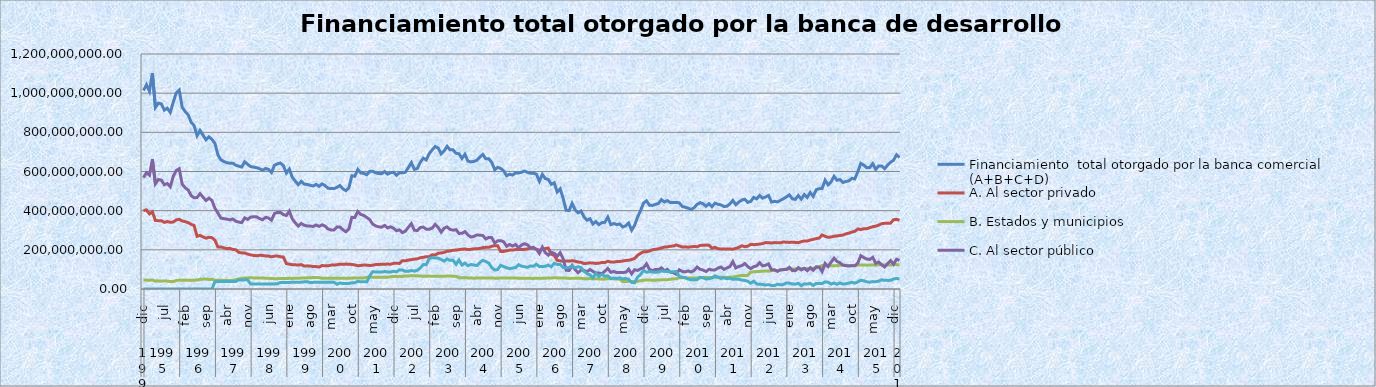
| Category | Financiamiento  total otorgado por la banca comercial (A+B+C+D)  | A. Al sector privado  | B. Estados y municipios  | C. Al sector público  | D. Otros  |
|---|---|---|---|---|---|
| 0 | 1013759422.311 | 400063716.096 | 45305367.947 | 568390338.269 | 0 |
| 1 | 1043258163.285 | 403913415.998 | 45420746.077 | 593924001.211 | 0 |
| 2 | 1009134550.045 | 383374612.839 | 44694134.748 | 581065802.458 | 0 |
| 3 | 1102391728.948 | 393973178.428 | 46096469.255 | 662322081.264 | 0 |
| 4 | 926967845.892 | 349683881.886 | 40066765.647 | 537217198.359 | 0 |
| 5 | 949112419.855 | 348849746.567 | 40961895.329 | 559300777.959 | 0 |
| 6 | 945465827.873 | 349121375.24 | 40300629.555 | 556043823.078 | 0 |
| 7 | 913150563.498 | 340225925.27 | 40392504.281 | 532532133.946 | 0 |
| 8 | 923301489.197 | 344502504.427 | 40314352.648 | 538484632.122 | 0 |
| 9 | 901114473.518 | 340871398.832 | 38402080.778 | 521840993.908 | 0 |
| 10 | 954073362.155 | 341833775.714 | 37476021.571 | 574763564.87 | 0 |
| 11 | 1001304203.055 | 352761577.691 | 43529335.426 | 605013289.937 | 0 |
| 12 | 1016268312.671 | 356184126.198 | 45624290.098 | 614459896.375 | 0 |
| 13 | 928514569.577 | 347484875.566 | 45116147.236 | 535913546.775 | 0 |
| 14 | 906002887.062 | 344002355.635 | 45017991.304 | 516982540.123 | 0 |
| 15 | 889604159.521 | 338857363.009 | 44986368.766 | 505760427.746 | 0 |
| 16 | 851789507.846 | 330726173.25 | 43908480.305 | 477154854.291 | 0 |
| 17 | 834599606.824 | 323961666.939 | 44868300.166 | 465769639.719 | 0 |
| 18 | 782596629.535 | 269241074.654 | 46261768.297 | 467093786.584 | 0 |
| 19 | 809769263.149 | 273675482.968 | 49122635.427 | 486971144.754 | 0 |
| 20 | 785521002.259 | 266025258.291 | 50408739.999 | 469087003.969 | 0 |
| 21 | 761919282.189 | 259550259.016 | 50685693.778 | 451683329.395 | 0 |
| 22 | 776871643.44 | 264157259.627 | 48699710.756 | 464014673.057 | 0 |
| 23 | 763984702.837 | 262272126.678 | 49645598.942 | 452066977.217 | 0 |
| 24 | 744108008.95 | 248950043.082 | 45310017.842 | 412315238.187 | 37532709.839 |
| 25 | 685041782.07 | 214222417.398 | 45209578.53 | 387901005.269 | 37708780.873 |
| 26 | 659671685.688 | 215047609.503 | 44857109.026 | 361881491.798 | 37885475.361 |
| 27 | 651096060.135 | 210072672.293 | 43583324.561 | 359435278.198 | 38004785.083 |
| 28 | 645141965.447 | 205955062.883 | 44450352.966 | 356705953.333 | 38030596.265 |
| 29 | 642291126.064 | 207894679.326 | 43192826.913 | 353131357.694 | 38072262.132 |
| 30 | 642630839.335 | 201775402.02 | 45132657.289 | 357657186.82 | 38065593.206 |
| 31 | 632017710.128 | 200698547.233 | 47110189.856 | 346132276.283 | 38076696.756 |
| 32 | 627312136.936 | 187028689.356 | 51790747.632 | 341893348.301 | 46599351.648 |
| 33 | 623073557.847 | 184463123.985 | 53403138.484 | 338766730.851 | 46440564.527 |
| 34 | 649379588.859 | 183593594.324 | 56227551.367 | 362922448.213 | 46635994.955 |
| 35 | 636597840.178 | 178341822.72 | 56137769.609 | 355528928.439 | 46589319.41 |
| 36 | 625140378.615 | 174147048.128 | 58087378.396 | 367242476.617 | 25663475.475 |
| 37 | 622363907.296 | 171342118.377 | 56242704.471 | 368616108.938 | 26162975.51 |
| 38 | 619555266.338 | 169809220.917 | 55807489.809 | 368304739.618 | 25633815.994 |
| 39 | 614216659.91 | 172322470.03 | 56548806.514 | 359702812.556 | 25642570.81 |
| 40 | 606476323.801 | 171297933.807 | 56195357.206 | 353376452.229 | 25606580.559 |
| 41 | 615240739.496 | 168889369.571 | 55197639.2 | 365640281.773 | 25513448.951 |
| 42 | 611022221.229 | 168007433.718 | 54705947.277 | 362754345.775 | 25554494.459 |
| 43 | 594989565.55 | 164555650.955 | 53567841.272 | 351220652.418 | 25645420.904 |
| 44 | 631722609.291 | 167710840.995 | 52805880.151 | 385231716.628 | 25974171.517 |
| 45 | 639076564.424 | 168297961.966 | 52808028.803 | 390888932.254 | 27081641.402 |
| 46 | 643008633.953 | 164660735.578 | 53332609.471 | 391216897.091 | 33798391.812 |
| 47 | 629882162.123 | 163028246.811 | 53325664.239 | 379955082.217 | 33573168.856 |
| 48 | 592330262.587 | 129866654.162 | 53295751.014 | 375519265.524 | 33648591.887 |
| 49 | 612473371.561 | 126739749.641 | 54499618.09 | 397538651.393 | 33695352.437 |
| 50 | 570116076.218 | 124176754.561 | 53937217.884 | 357985040.156 | 34017063.618 |
| 51 | 550783756.357 | 123491107.333 | 55113684.608 | 337837134.138 | 34341830.278 |
| 52 | 533060548.812 | 122217192.562 | 55180250.899 | 321048033.767 | 34615071.584 |
| 53 | 549779748.038 | 124405151.892 | 55644550.238 | 334743054.005 | 34986991.902 |
| 54 | 535455330.439 | 117362564.47 | 56010452.957 | 325581483.612 | 36500829.401 |
| 55 | 533847706.511 | 118191368.399 | 57144108.286 | 321780560.829 | 36731668.997 |
| 56 | 529867407.073 | 117180826.857 | 57823472.654 | 321251114.705 | 33611992.858 |
| 57 | 525830069.301 | 114633654.769 | 58252849.385 | 319136813.252 | 33806751.895 |
| 58 | 534313651.916 | 114512195.627 | 58713116.177 | 326852102.316 | 34236237.795 |
| 59 | 524211521.646 | 112062454.564 | 57995511.513 | 319788923.722 | 34364631.847 |
| 60 | 536717338.633 | 120006535.375 | 54333378.012 | 327832247.481 | 34545177.766 |
| 61 | 528467790.439 | 118143850.589 | 54274551.478 | 321403933.16 | 34645455.212 |
| 62 | 514076521.381 | 118308892.598 | 54399747.211 | 306429259.368 | 34938622.203 |
| 63 | 513418723.72 | 121852557.885 | 54804250.663 | 301643949.933 | 35117965.239 |
| 64 | 512743343.564 | 122279160.205 | 54411512.191 | 301401902.246 | 34650768.922 |
| 65 | 519110167.176 | 123880300.471 | 54393768.15 | 316392629.621 | 24443468.934 |
| 66 | 528595832.129 | 126909483.163 | 54606863 | 316241112.29 | 30838373.676 |
| 67 | 511385013.277 | 125701348.771 | 54881697.003 | 302552295.594 | 28249671.909 |
| 68 | 502224349.089 | 127133420.318 | 54500151.069 | 292322590.476 | 28268187.225 |
| 69 | 515935828.505 | 126752787.372 | 54494504.128 | 306078042.802 | 28610494.202 |
| 70 | 578333497.313 | 125125661.704 | 55917782.209 | 366158556.004 | 31131497.396 |
| 71 | 575716533.717 | 123095541.239 | 55654025.269 | 364548971.32 | 32417995.889 |
| 72 | 609941116.094 | 118883037.677 | 55766214.098 | 396034143.255 | 39257721.064 |
| 73 | 592601719.228 | 119878073.321 | 55572321.133 | 380677440.848 | 36473883.924 |
| 74 | 590816863.458 | 122301208.877 | 56387509.217 | 375550085.664 | 36578059.7 |
| 75 | 583464109.195 | 121849097.632 | 59654472.233 | 365591044.363 | 36369494.967 |
| 76 | 600875050.673 | 120003122.421 | 59650558.116 | 354329545.458 | 66891824.678 |
| 77 | 601167916.934 | 121288706.179 | 59757207.777 | 331531165.774 | 88590837.203 |
| 78 | 593836124.584 | 124809492.86 | 59914754.506 | 322352489.136 | 86759388.081 |
| 79 | 589771961.413 | 125083331.541 | 60568906.667 | 317562654.845 | 86557068.359 |
| 80 | 588669250.484 | 126531349.768 | 60372046.899 | 315448250.057 | 86317603.759 |
| 81 | 599693275.251 | 125733199.22 | 60064701.786 | 324711162.509 | 89184211.735 |
| 82 | 586426559.677 | 127583454.929 | 59761703.404 | 311862365.354 | 87219035.99 |
| 83 | 593799511.413 | 126457684.585 | 62845328.553 | 317405362.354 | 87091135.921 |
| 84 | 595922887.017 | 130887150.746 | 64033518.212 | 310472903.555 | 90529314.504 |
| 85 | 580494787.47 | 131400266.992 | 63643911.847 | 297410186.224 | 88040422.407 |
| 86 | 594958333.088 | 130589970.02 | 64585622.516 | 301966983.068 | 97815757.485 |
| 87 | 593403876.567 | 144605113.88 | 64065826.417 | 287828374.324 | 96904561.946 |
| 88 | 596309067.253 | 143698032.401 | 66552098.988 | 295861299.113 | 90197636.751 |
| 89 | 620552454.178 | 147625584.759 | 66804427.761 | 315597012.524 | 90525429.133 |
| 90 | 645597234.162 | 149996929.608 | 67296795.708 | 333977323.228 | 94326185.617 |
| 91 | 611002805.169 | 152359435.801 | 67139182.531 | 300220818.82 | 91283368.016 |
| 92 | 615495377.228 | 154073956.048 | 67371069.001 | 298352080.306 | 95698271.873 |
| 93 | 646582971.278 | 159359122.189 | 66072881.244 | 313942042.957 | 107208924.887 |
| 94 | 668236959.821 | 162021646.908 | 65328282.307 | 316004056.799 | 124882973.806 |
| 95 | 658936163.474 | 164850395.692 | 64983024.638 | 305289792.275 | 123812950.869 |
| 96 | 691644995.178 | 164940243.011 | 65869997.755 | 305058873.882 | 155775880.53 |
| 97 | 710407112.066 | 174647098.492 | 65351413.735 | 310931225.381 | 159477374.458 |
| 98 | 727733806.336 | 173563920.623 | 65561312.683 | 329930998.894 | 158677574.136 |
| 99 | 719859724.421 | 182567553.248 | 65245101.393 | 314540179.143 | 157506890.636 |
| 100 | 689552366.141 | 183745815.539 | 64924888.399 | 290287591.017 | 150594071.187 |
| 101 | 705038188.179 | 187019195.227 | 65128182.506 | 310585688.836 | 142305121.61 |
| 102 | 728757070.675 | 192744089.913 | 66093944.914 | 317089477.724 | 152829558.124 |
| 103 | 710451834.338 | 193800898.312 | 65856287.96 | 304428030.326 | 146366617.74 |
| 104 | 710690010.63 | 198109377.203 | 65607309.621 | 300359171.16 | 146614152.645 |
| 105 | 692800241.824 | 198766909.219 | 64987921.35 | 302868246.592 | 126177164.663 |
| 106 | 690505153.955 | 200958874.314 | 57828126.886 | 283943755.868 | 147774396.887 |
| 107 | 666760465.172 | 203151007.669 | 57168239.867 | 284202027.579 | 122239190.057 |
| 108 | 687973040.704 | 204128123.56 | 58106577.364 | 293371682.048 | 132366657.732 |
| 109 | 652897828.076 | 201344398.348 | 56812761.338 | 275819413.354 | 118921255.037 |
| 110 | 649017550.46 | 202609248.746 | 55980385.777 | 265320551.397 | 125107364.54 |
| 111 | 651587992.971 | 204888655.796 | 55334820.14 | 268634484.808 | 122730032.229 |
| 112 | 657163833.929 | 205051970.151 | 56206862.124 | 276098455.081 | 119806546.573 |
| 113 | 673162108.612 | 207168374.47 | 56312947.993 | 274694311.132 | 134986475.017 |
| 114 | 687186907.454 | 210998937.384 | 56141116.744 | 273210197.193 | 146836656.133 |
| 115 | 664818847.559 | 212795703.72 | 56149342.987 | 255445001.736 | 140428799.116 |
| 116 | 664818334.872 | 212896818.167 | 56015714.706 | 263551169.795 | 132354632.204 |
| 117 | 646701005.082 | 218218751.579 | 56799426.909 | 262399670.419 | 109283156.174 |
| 118 | 608805470.562 | 221500402.949 | 55296337.941 | 234907343.61 | 97101386.062 |
| 119 | 621293008.789 | 221294744.154 | 54869245.782 | 245786118.807 | 99342900.046 |
| 120 | 615720209.192 | 191251727.933 | 56309836.332 | 247094838.861 | 121063806.066 |
| 121 | 603533130.24 | 192006176.59 | 56017706.094 | 241077673.147 | 114431574.409 |
| 122 | 578354340.261 | 194715285.366 | 56659520.606 | 218348155.253 | 108631379.036 |
| 123 | 586208844.852 | 198512001.369 | 56534936.052 | 227452275.616 | 103709631.815 |
| 124 | 581641896.179 | 198884262.048 | 56415493.618 | 219610186.669 | 106731953.845 |
| 125 | 593237858.313 | 201194928.039 | 55671384.101 | 227126336.691 | 109245209.482 |
| 126 | 591895986.978 | 201756659.632 | 55339042.805 | 210827850.592 | 123972433.949 |
| 127 | 596272673.829 | 201085799.373 | 54215355.637 | 224397144.289 | 116574374.53 |
| 128 | 602331827.486 | 202464844.422 | 54692260.779 | 231342022.618 | 113832699.667 |
| 129 | 595830765.679 | 204562155.757 | 54513195.405 | 225807910.523 | 110947503.994 |
| 130 | 591568895.438 | 209060485.411 | 54472764.694 | 210081139.886 | 117954505.447 |
| 131 | 590992778.025 | 212704772.581 | 53906196.31 | 208445404.141 | 115936404.994 |
| 132 | 586571173.56 | 202190438.499 | 55182859.815 | 202968434.66 | 126229440.586 |
| 133 | 549895349.003 | 198464694.119 | 55102913.242 | 181665171.797 | 114662569.846 |
| 134 | 585130493.587 | 202432067.113 | 54754837.858 | 213777649.216 | 114165939.4 |
| 135 | 563673046.869 | 206708910.585 | 55087994.683 | 185642411.518 | 116233730.082 |
| 136 | 559693572.581 | 208976772.703 | 55985656.887 | 172684841.79 | 122046301.202 |
| 137 | 534532829.946 | 177752365.974 | 56185783.915 | 187469562.398 | 113125117.659 |
| 138 | 542455521.236 | 171685792.518 | 57507756.316 | 182125367.074 | 131136605.328 |
| 139 | 495004101.718 | 146032081.39 | 56732589.237 | 167070758.425 | 125168672.666 |
| 140 | 511426980.75 | 143559515.67 | 56629579.388 | 185490179.677 | 125747706.016 |
| 141 | 462409633.652 | 141511333.354 | 56070411.17 | 155048901.074 | 109778988.053 |
| 142 | 402091042.258 | 142589617.851 | 55585205.377 | 95790875.311 | 108125343.719 |
| 143 | 400726561.211 | 142257402.276 | 54028340.897 | 94372130.434 | 110068687.604 |
| 144 | 437354064.871 | 144636234.621 | 54409688.853 | 120416790.434 | 117891350.963 |
| 145 | 404795247.753 | 142227099.274 | 54939877.439 | 99375727.97 | 108252543.07 |
| 146 | 389191606.464 | 137665824.459 | 54957648.02 | 82718565.589 | 113849568.396 |
| 147 | 398157737.564 | 136390090.762 | 55064362.837 | 97447300.627 | 109255983.338 |
| 148 | 367971781.888 | 129568424.091 | 52366365.145 | 95279551.803 | 90757440.849 |
| 149 | 351346977.859 | 131117451.775 | 52770546.192 | 88410684.926 | 79048294.966 |
| 150 | 358587911.941 | 133611869.477 | 53111451.754 | 99644896.477 | 72219694.234 |
| 151 | 332084680.165 | 132448734.773 | 52800831.506 | 89767877.682 | 57067236.204 |
| 152 | 344440368.991 | 130505347.056 | 52548096.957 | 81192179.205 | 80194745.773 |
| 153 | 328868278.799 | 131834032.524 | 51324135.984 | 81368652.671 | 64341457.62 |
| 154 | 338888594.628 | 135348207.219 | 50502588.876 | 77974776.252 | 75063022.281 |
| 155 | 340639294.324 | 134884698.887 | 50357432.142 | 90635046.57 | 64762116.725 |
| 156 | 367486103.382 | 141741402.595 | 53309405.72 | 104996821.794 | 67438473.273 |
| 157 | 328638121.313 | 137485161.19 | 52423093.861 | 85236449.41 | 53493416.851 |
| 158 | 334233680.854 | 137198024.428 | 51780432.073 | 89480984.503 | 55774239.85 |
| 159 | 328871465.192 | 140192794.188 | 51193709.373 | 83928620.69 | 53556340.941 |
| 160 | 331878697.977 | 140197623.354 | 51051500.357 | 83816922.495 | 56812651.771 |
| 161 | 316443040.6 | 142563123.624 | 37637705.33 | 84238183.54 | 52004028.107 |
| 162 | 322675706.718 | 145638785.232 | 38053114.439 | 85342219.559 | 53641587.487 |
| 163 | 337205695.674 | 146716978.165 | 39577581.176 | 101188581.559 | 49722554.774 |
| 164 | 300148122.498 | 150529909.999 | 38546092.918 | 77542665.538 | 33529454.043 |
| 165 | 325268693.053 | 155949539.456 | 38417845.164 | 98525880.946 | 32375427.487 |
| 166 | 367148202.141 | 172169731.391 | 39441759.605 | 94883286.141 | 60653425.004 |
| 167 | 400677877.039 | 181591336.919 | 42081721.144 | 103081322.08 | 73923496.897 |
| 168 | 438609466.35 | 190413981.313 | 45254179.514 | 108634138.415 | 94307167.109 |
| 169 | 450459048.443 | 189996595.904 | 45551368.347 | 128927545.111 | 85983539.081 |
| 170 | 427815539.061 | 193886349.332 | 45477788.244 | 99770803.515 | 88680597.97 |
| 171 | 426664402.675 | 200619576.172 | 44968442.236 | 94473872.746 | 86602511.521 |
| 172 | 432118064.797 | 202532968.428 | 44905992.098 | 99581729.419 | 85097374.852 |
| 173 | 436536183.243 | 204670107.174 | 46066545.61 | 98879831.288 | 86919699.171 |
| 174 | 456395449.782 | 209648976.615 | 46714322.561 | 108091930.382 | 91940220.224 |
| 175 | 444337581.243 | 213912345.929 | 46799996.083 | 93383787.9 | 90241451.331 |
| 176 | 451333879.095 | 214705544.254 | 47123578.31 | 99995156.655 | 89509599.877 |
| 177 | 441413210.647 | 218418589.29 | 49688509.89 | 86002867.243 | 87303244.224 |
| 178 | 441483213.413 | 219325270.954 | 51452831.683 | 83118264.564 | 87586846.213 |
| 179 | 442357110.422 | 225004414.786 | 52405149.41 | 75567960.18 | 89379586.046 |
| 180 | 439913504.482 | 219663377.275 | 57816978.588 | 98284175.047 | 64148973.572 |
| 181 | 421907632.624 | 214380420.58 | 57673759.761 | 89669293.388 | 60184158.895 |
| 182 | 417228146.864 | 215149199.37 | 56680689.183 | 87274319.31 | 58123939 |
| 183 | 412954393.202 | 213333035.606 | 56084695.984 | 92404005.679 | 51132655.933 |
| 184 | 405884366.322 | 215605484.278 | 56313900.577 | 86660137.986 | 47304843.481 |
| 185 | 415334067.312 | 217236267.776 | 56728635.846 | 94916373.962 | 46452789.728 |
| 186 | 432017360.392 | 215586379.773 | 56688553.811 | 112219117.857 | 47523308.951 |
| 187 | 440947816.975 | 222387607.27 | 57142132.893 | 100952005.945 | 60466070.868 |
| 188 | 435541502.722 | 223309787.547 | 58544945.729 | 96467761.053 | 57219008.393 |
| 189 | 422698176.65 | 224175168.117 | 58330001.079 | 89299246.772 | 50893760.681 |
| 190 | 435734077.65 | 223591579.902 | 58573066.529 | 100769109.372 | 52800321.847 |
| 191 | 420419559.433 | 208243451.859 | 58506528.901 | 97159863.648 | 56509715.025 |
| 192 | 438143905.798 | 213213739.102 | 60326309.325 | 97527129.182 | 67076728.189 |
| 193 | 432805741.908 | 205746728.459 | 59958197.31 | 106915257.214 | 60185558.926 |
| 194 | 429556683.631 | 203946379.866 | 59538538.229 | 112193056.936 | 53878708.6 |
| 195 | 421346914.095 | 204338292.806 | 59517273.332 | 100148906.217 | 57342441.739 |
| 196 | 422362334.183 | 203854897.856 | 58751906.458 | 107492928.792 | 52262601.077 |
| 197 | 434502473.862 | 204068354.557 | 60824583.692 | 114119866.861 | 55489668.752 |
| 198 | 452175192.171 | 202854161.794 | 60393668.596 | 139721607.141 | 49205754.641 |
| 199 | 430460013.331 | 207485398.076 | 64369344.714 | 107661731.38 | 50943539.161 |
| 200 | 443798887.565 | 212000925.705 | 67572915.177 | 114808320.421 | 49416726.261 |
| 201 | 453983126.418 | 220641283.304 | 68414237.023 | 119403953.352 | 45523652.739 |
| 202 | 458781962.05 | 216101170.183 | 68984505.157 | 129751548.106 | 43944738.603 |
| 203 | 442165011.148 | 218659036.872 | 69374108.873 | 114569088.767 | 39562776.636 |
| 204 | 447229267.704 | 227952155.942 | 85621164.45 | 104072871.339 | 29583075.972 |
| 205 | 467703040.735 | 226396507.614 | 87745533.351 | 113866900.004 | 39694099.766 |
| 206 | 460240966.161 | 227146035.255 | 89019718.458 | 118135701.845 | 25939510.603 |
| 207 | 477365411.837 | 229643983.129 | 89067833.505 | 134457595.929 | 24195999.273 |
| 208 | 463992524.082 | 231584324.75 | 91074864.72 | 118009122.309 | 23324212.304 |
| 209 | 469752150.646 | 237101767.101 | 91623460.284 | 120966252.803 | 20060670.459 |
| 210 | 477930695.166 | 236241478.089 | 91228405.411 | 128331526.759 | 22129284.907 |
| 211 | 443749107.313 | 234840215.693 | 93554456.766 | 97638344.575 | 17716090.279 |
| 212 | 447784496.433 | 237059448.703 | 94970248.578 | 98395909.916 | 17358889.237 |
| 213 | 444875247.534 | 235847464.135 | 94538055.474 | 89915253.019 | 24574474.906 |
| 214 | 452393405.973 | 236115318.316 | 97081005.476 | 97715512.147 | 21481570.033 |
| 215 | 460824429.907 | 240203768.224 | 98926649.533 | 98947873.832 | 22746138.318 |
| 216 | 470259336.479 | 238687898.849 | 101857084.647 | 99010927.214 | 30703425.769 |
| 217 | 480834566.95 | 237917216.144 | 102302383.96 | 110773919.464 | 29841047.382 |
| 218 | 460614954.532 | 238706301.752 | 101906078.109 | 94383898.603 | 25618676.068 |
| 219 | 457592199.226 | 237967086.842 | 101563232.785 | 93312089.686 | 24749789.912 |
| 220 | 477349531.511 | 236631112.822 | 102083534.114 | 109312478.684 | 29322405.89 |
| 221 | 459032558.803 | 241725725.088 | 102530935.232 | 97719670.503 | 17056227.981 |
| 222 | 482513383.957 | 245560310.185 | 104491943.486 | 105785847.485 | 26675282.802 |
| 223 | 467502390.225 | 244638919.427 | 104278423.519 | 93619197.304 | 24965849.976 |
| 224 | 492978568.281 | 250180739.639 | 105253063.773 | 108755087.313 | 28789677.556 |
| 225 | 472968476.511 | 253374624.067 | 106059579.431 | 95605231.048 | 17929041.965 |
| 226 | 506805172.602 | 257297987.219 | 107912686.622 | 113004974.146 | 28589524.616 |
| 227 | 512344040.876 | 260237509.019 | 110924779.024 | 112922941.771 | 28258811.061 |
| 228 | 513433943.753 | 275967257.955 | 120610133.802 | 89075868.996 | 27780683 |
| 229 | 555694878.45 | 268960753.744 | 119258549.398 | 130834892.671 | 36640682.636 |
| 230 | 532034901.144 | 263960591.364 | 119063712.209 | 114462482.49 | 34548115.081 |
| 231 | 546949323.159 | 265426358.323 | 118969338.367 | 137109374.088 | 25444252.381 |
| 232 | 575456937.85 | 269088392.92 | 118539618.914 | 157359565.233 | 30469360.782 |
| 233 | 555129644.441 | 270995688.146 | 119569743.262 | 140559472.838 | 24004740.196 |
| 234 | 559180357.872 | 273309062.117 | 120978034.456 | 133736972.375 | 31156288.923 |
| 235 | 544080534.716 | 275367514.509 | 121602406.398 | 122033397.622 | 25077216.187 |
| 236 | 549134140.235 | 282011060.668 | 121058186.851 | 119232750.93 | 26832141.787 |
| 237 | 552560990.53 | 285079822.537 | 120206047.973 | 116938774.256 | 30336345.764 |
| 238 | 564870449.249 | 290780368.162 | 120217266.451 | 119188842.532 | 34683972.104 |
| 239 | 562432814.976 | 294511872.581 | 119313078.715 | 118857703.93 | 29750159.75 |
| 240 | 598869604.253 | 306447146.71 | 122840584.53 | 132896955.859 | 36684917.154 |
| 241 | 641378793.315 | 303349998.275 | 123172109.63 | 170587953.844 | 44268731.566 |
| 242 | 632338730.697 | 307471225.92 | 122605681.133 | 160162061.219 | 42099762.425 |
| 243 | 619477664.235 | 308223209.341 | 121719554.725 | 152943506.477 | 36591393.692 |
| 244 | 620342997.98 | 312765929.778 | 122075436.847 | 150733018.179 | 34768613.176 |
| 245 | 640035372.827 | 318196484.227 | 122380784.182 | 161733360.976 | 37724743.444 |
| 246 | 610655397.644 | 320989647.114 | 121441575.398 | 130977337.484 | 37246837.648 |
| 247 | 628211879.133 | 326094234.81 | 124621633.887 | 137783066.961 | 39712943.476 |
| 248 | 628409579.542 | 333505589.785 | 123816449.692 | 123905570.88 | 47181969.185 |
| 249 | 614651413.847 | 335322332.183 | 122448365.28 | 112413382.53 | 44467333.853 |
| 250 | 632474176.816 | 336311435.994 | 122083762.882 | 130062860.915 | 44016117.026 |
| 251 | 647533523.647 | 336320190.426 | 121959860.569 | 145196675.166 | 44056797.486 |
| 252 | 657082797.051 | 353855239.935 | 126034356.123 | 126022402.389 | 51170798.603 |
| 253 | 685818643.683 | 355656395.818 | 124332355.611 | 152109640.792 | 53720251.462 |
| 254 | 670981891.971 | 350811306.64 | 123381710.389 | 146181229.237 | 50607645.705 |